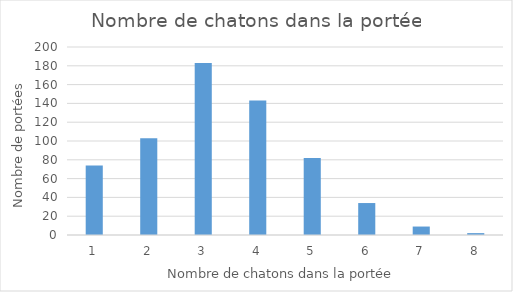
| Category | Series 0 |
|---|---|
| 1.0 | 74 |
| 2.0 | 103 |
| 3.0 | 183 |
| 4.0 | 143 |
| 5.0 | 82 |
| 6.0 | 34 |
| 7.0 | 9 |
| 8.0 | 2 |